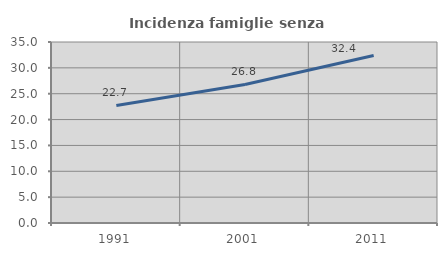
| Category | Incidenza famiglie senza nuclei |
|---|---|
| 1991.0 | 22.731 |
| 2001.0 | 26.789 |
| 2011.0 | 32.397 |